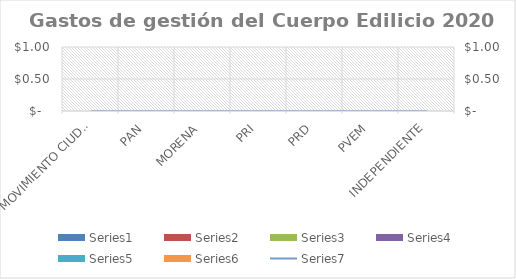
| Category | Series 0 | Series 1 | Series 2 | Series 3 | Series 4 | Series 5 |
|---|---|---|---|---|---|---|
| MOVIMIENTO CIUDADANO | 0 | 0 | 0 | 0 | 0 | 0 |
| PAN | 0 | 0 | 0 | 0 | 0 | 0 |
| MORENA | 0 | 0 | 0 | 0 | 0 | 0 |
| PRI | 0 | 0 | 0 | 0 | 0 | 0 |
| PRD | 0 | 0 | 0 | 0 | 0 | 0 |
| PVEM | 0 | 0 | 0 | 0 | 0 | 0 |
| INDEPENDIENTE | 0 | 0 | 0 | 0 | 0 | 0 |